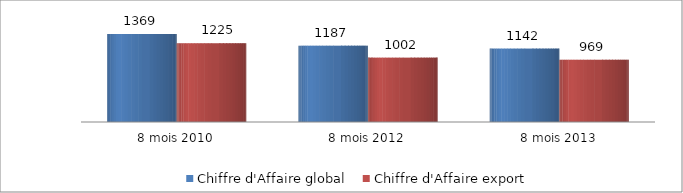
| Category | Chiffre d'Affaire global  | Chiffre d'Affaire export  |
|---|---|---|
| 8 mois 2010 | 1369.221 | 1225.319 |
| 8 mois 2012 | 1187.293 | 1001.512 |
| 8 mois 2013 | 1142.426 | 968.728 |